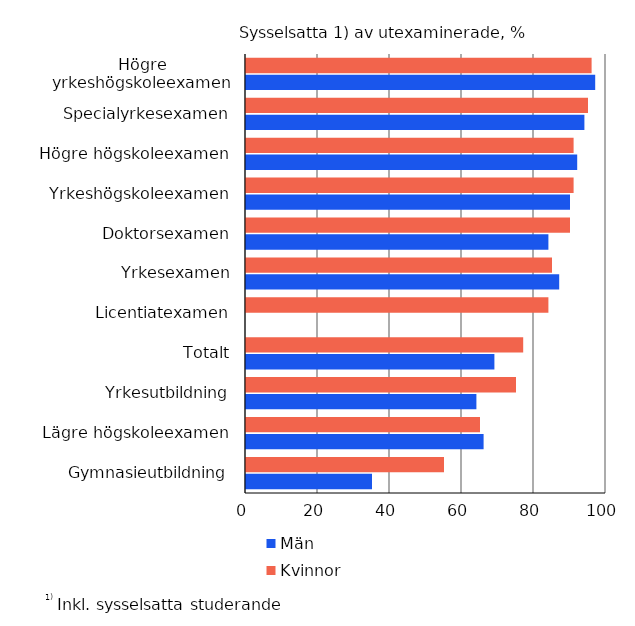
| Category | Män | Kvinnor |
|---|---|---|
| Gymnasieutbildning | 35 | 55 |
| Lägre högskoleexamen | 66 | 65 |
| Yrkesutbildning | 64 | 75 |
| Totalt | 69 | 77 |
| Licentiatexamen | 0 | 84 |
| Yrkesexamen | 87 | 85 |
| Doktorsexamen | 84 | 90 |
| Yrkeshögskoleexamen | 90 | 91 |
| Högre högskoleexamen | 92 | 91 |
| Specialyrkesexamen | 94 | 95 |
| Högre yrkeshögskoleexamen | 97 | 96 |